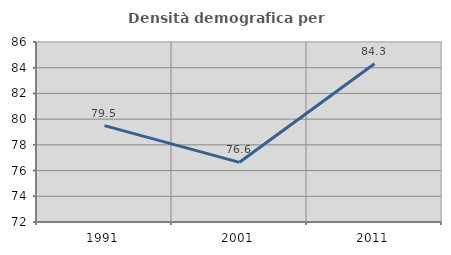
| Category | Densità demografica |
|---|---|
| 1991.0 | 79.499 |
| 2001.0 | 76.641 |
| 2011.0 | 84.305 |